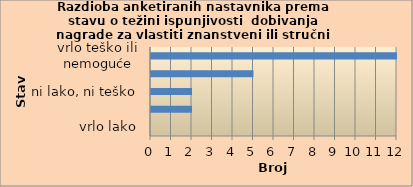
| Category | Series 0 |
|---|---|
| vrlo lako | 0 |
| lako | 2 |
| ni lako, ni teško | 2 |
| teško | 5 |
| vrlo teško ili nemoguće | 12 |